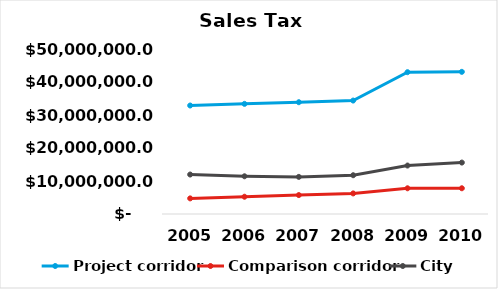
| Category | Project corridor | Comparison corridor | City |
|---|---|---|---|
| 2005.0 | 32876298 | 4733914 | 11960142.333 |
| 2006.0 | 33376298 | 5233914 | 11432133.667 |
| 2007.0 | 33876298 | 5733914 | 11247562 |
| 2008.0 | 34376298 | 6233914 | 11747562 |
| 2009.0 | 42970372.5 | 7792392.5 | 14684452.5 |
| 2010.0 | 43077798.431 | 7800184.892 | 15585721.504 |